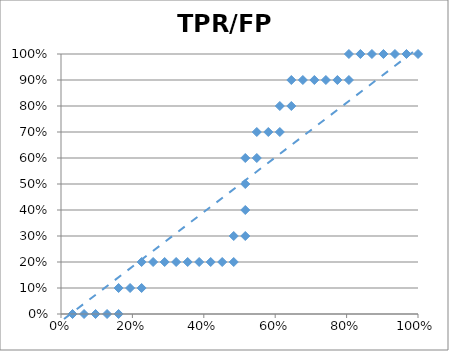
| Category | TPR |
|---|---|
| 0.03225806451612903 | 0 |
| 0.06451612903225806 | 0 |
| 0.0967741935483871 | 0 |
| 0.12903225806451613 | 0 |
| 0.16129032258064516 | 0 |
| 0.16129032258064516 | 0.1 |
| 0.1935483870967742 | 0.1 |
| 0.22580645161290322 | 0.1 |
| 0.22580645161290322 | 0.2 |
| 0.25806451612903225 | 0.2 |
| 0.2903225806451613 | 0.2 |
| 0.3225806451612903 | 0.2 |
| 0.3548387096774194 | 0.2 |
| 0.3870967741935484 | 0.2 |
| 0.41935483870967744 | 0.2 |
| 0.45161290322580644 | 0.2 |
| 0.4838709677419355 | 0.2 |
| 0.4838709677419355 | 0.3 |
| 0.5161290322580645 | 0.3 |
| 0.5161290322580645 | 0.4 |
| 0.5161290322580645 | 0.5 |
| 0.5161290322580645 | 0.6 |
| 0.5483870967741935 | 0.6 |
| 0.5483870967741935 | 0.7 |
| 0.5806451612903226 | 0.7 |
| 0.6129032258064516 | 0.7 |
| 0.6129032258064516 | 0.8 |
| 0.6451612903225806 | 0.8 |
| 0.6451612903225806 | 0.9 |
| 0.6774193548387096 | 0.9 |
| 0.7096774193548387 | 0.9 |
| 0.7419354838709677 | 0.9 |
| 0.7741935483870968 | 0.9 |
| 0.8064516129032258 | 0.9 |
| 0.8064516129032258 | 1 |
| 0.8387096774193549 | 1 |
| 0.8709677419354839 | 1 |
| 0.9032258064516129 | 1 |
| 0.9354838709677419 | 1 |
| 0.967741935483871 | 1 |
| 1.0 | 1 |